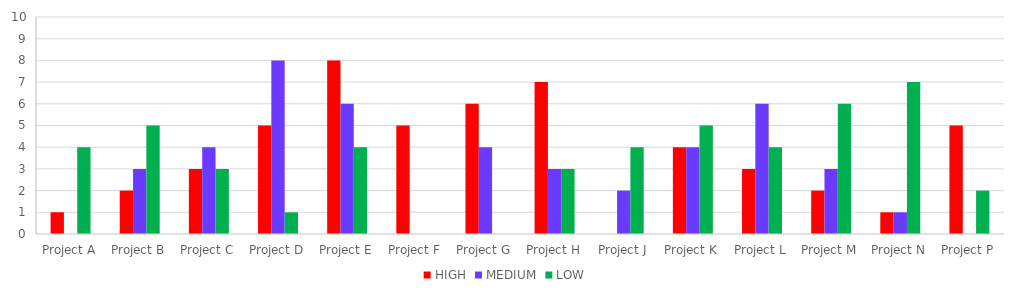
| Category | HIGH | MEDIUM | LOW |
|---|---|---|---|
| Project A | 1 | 0 | 4 |
| Project B | 2 | 3 | 5 |
| Project C | 3 | 4 | 3 |
| Project D | 5 | 8 | 1 |
| Project E | 8 | 6 | 4 |
| Project F | 5 | 0 | 0 |
| Project G | 6 | 4 | 0 |
| Project H | 7 | 3 | 3 |
| Project J | 0 | 2 | 4 |
| Project K | 4 | 4 | 5 |
| Project L | 3 | 6 | 4 |
| Project M | 2 | 3 | 6 |
| Project N | 1 | 1 | 7 |
| Project P | 5 | 0 | 2 |